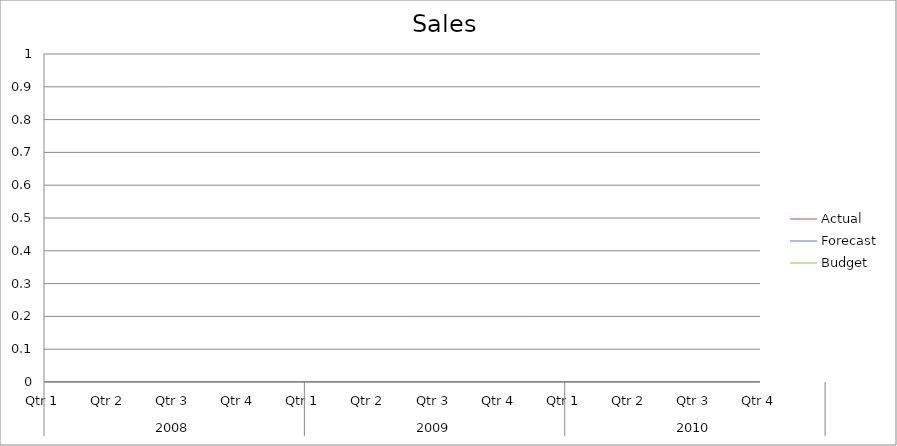
| Category | Budget | Forecast | Actual |
|---|---|---|---|
| 0 | 2730 | 860 | 580 |
| 1 | 2050 | 710 | 1550 |
| 2 | 760 | 1350 | 2980 |
| 3 | 3480 | 3450 | 1920 |
| 4 | 1760 | 2680 | 3360 |
| 5 | 3410 | 2090 | 2300 |
| 6 | 1910 | 2490 | 2290 |
| 7 | 1830 | 3370 | 1110 |
| 8 | 3260 | 1100 | 2450 |
| 9 | 1800 | 1780 | 780 |
| 10 | 1450 | 1870 | 2280 |
| 11 | 2470 | 1510 | 3430 |